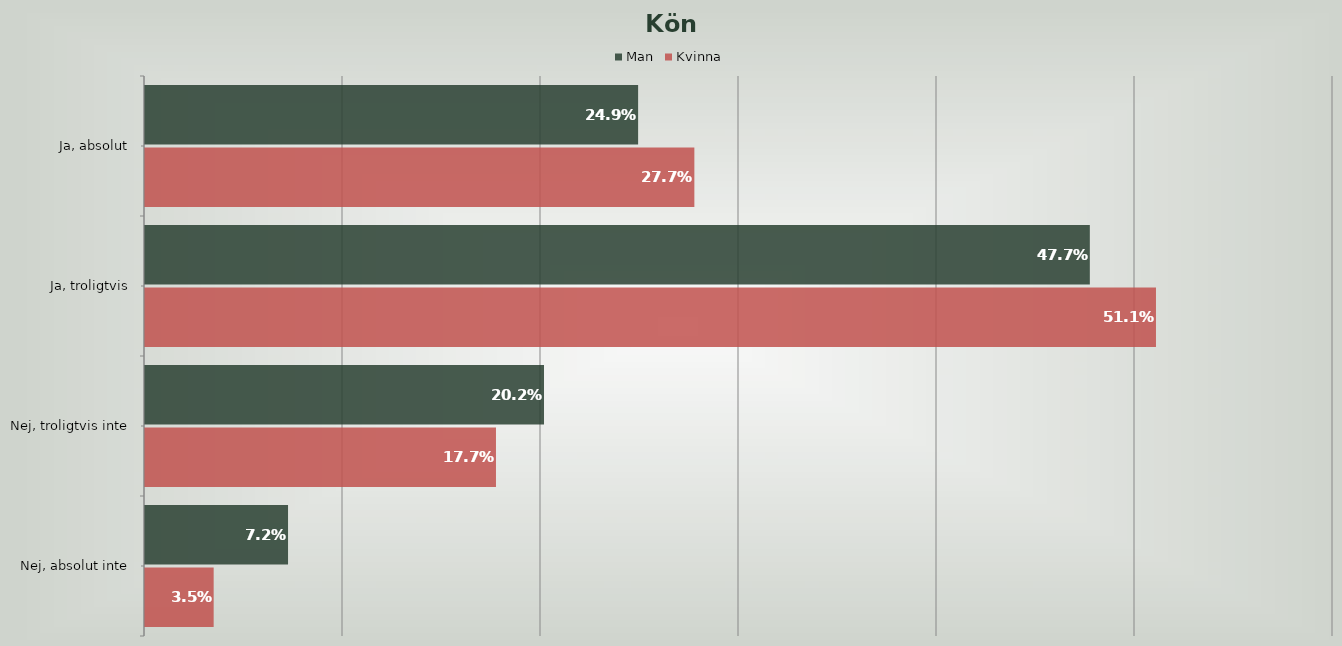
| Category | Man | Kvinna |
|---|---|---|
| Ja, absolut | 0.249 | 0.277 |
| Ja, troligtvis | 0.477 | 0.511 |
| Nej, troligtvis inte | 0.202 | 0.177 |
| Nej, absolut inte | 0.072 | 0.035 |